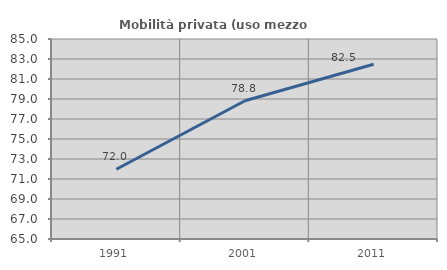
| Category | Mobilità privata (uso mezzo privato) |
|---|---|
| 1991.0 | 71.972 |
| 2001.0 | 78.825 |
| 2011.0 | 82.469 |